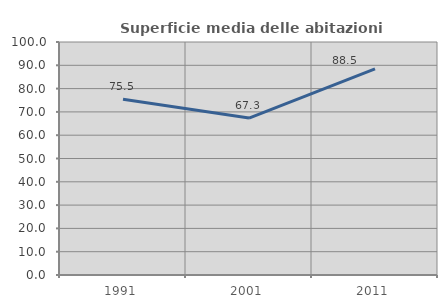
| Category | Superficie media delle abitazioni occupate |
|---|---|
| 1991.0 | 75.472 |
| 2001.0 | 67.339 |
| 2011.0 | 88.474 |